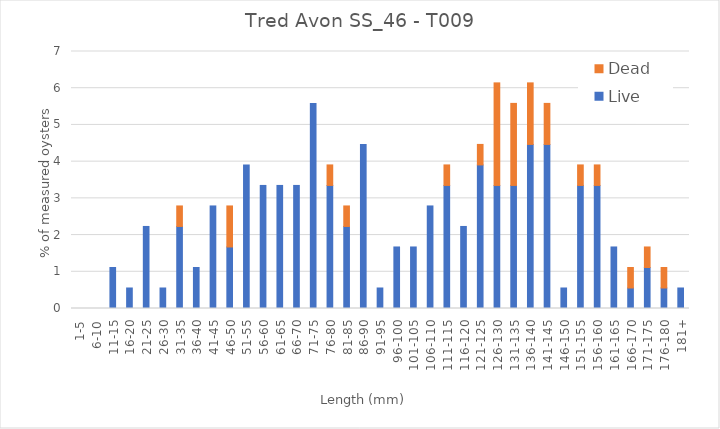
| Category | Live | Dead |
|---|---|---|
| 1-5 | 0 | 0 |
| 6-10 | 0 | 0 |
| 11-15 | 1.117 | 0 |
| 16-20 | 0.559 | 0 |
| 21-25 | 2.235 | 0 |
| 26-30 | 0.559 | 0 |
| 31-35 | 2.235 | 0.559 |
| 36-40 | 1.117 | 0 |
| 41-45 | 2.793 | 0 |
| 46-50 | 1.676 | 1.117 |
| 51-55 | 3.911 | 0 |
| 56-60 | 3.352 | 0 |
| 61-65 | 3.352 | 0 |
| 66-70 | 3.352 | 0 |
| 71-75 | 5.587 | 0 |
| 76-80 | 3.352 | 0.559 |
| 81-85 | 2.235 | 0.559 |
| 86-90 | 4.469 | 0 |
| 91-95 | 0.559 | 0 |
| 96-100 | 1.676 | 0 |
| 101-105 | 1.676 | 0 |
| 106-110 | 2.793 | 0 |
| 111-115 | 3.352 | 0.559 |
| 116-120 | 2.235 | 0 |
| 121-125 | 3.911 | 0.559 |
| 126-130 | 3.352 | 2.793 |
| 131-135 | 3.352 | 2.235 |
| 136-140 | 4.469 | 1.676 |
| 141-145 | 4.469 | 1.117 |
| 146-150 | 0.559 | 0 |
| 151-155 | 3.352 | 0.559 |
| 156-160 | 3.352 | 0.559 |
| 161-165 | 1.676 | 0 |
| 166-170 | 0.559 | 0.559 |
| 171-175 | 1.117 | 0.559 |
| 176-180 | 0.559 | 0.559 |
| 181+ | 0.559 | 0 |